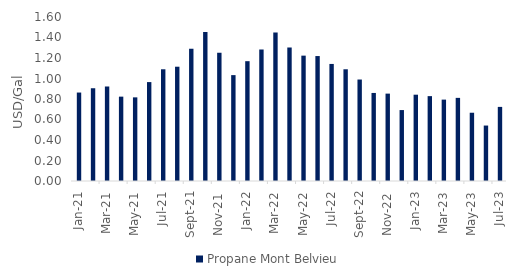
| Category | Propane Mont Belvieu |
|---|---|
| 2021-01-01 | 0.863 |
| 2021-02-01 | 0.905 |
| 2021-03-01 | 0.922 |
| 2021-04-01 | 0.823 |
| 2021-05-01 | 0.816 |
| 2021-06-01 | 0.965 |
| 2021-07-01 | 1.09 |
| 2021-08-01 | 1.115 |
| 2021-09-01 | 1.291 |
| 2021-10-01 | 1.454 |
| 2021-11-01 | 1.252 |
| 2021-12-01 | 1.033 |
| 2022-01-01 | 1.169 |
| 2022-02-01 | 1.283 |
| 2022-03-01 | 1.448 |
| 2022-04-01 | 1.302 |
| 2022-05-01 | 1.223 |
| 2022-06-01 | 1.219 |
| 2022-07-01 | 1.142 |
| 2022-08-01 | 1.09 |
| 2022-09-01 | 0.99 |
| 2022-10-01 | 0.859 |
| 2022-11-01 | 0.852 |
| 2022-12-01 | 0.692 |
| 2023-01-01 | 0.842 |
| 2023-02-01 | 0.828 |
| 2023-03-01 | 0.794 |
| 2023-04-01 | 0.811 |
| 2023-05-01 | 0.666 |
| 2023-06-01 | 0.541 |
| 2023-07-01 | 0.723 |